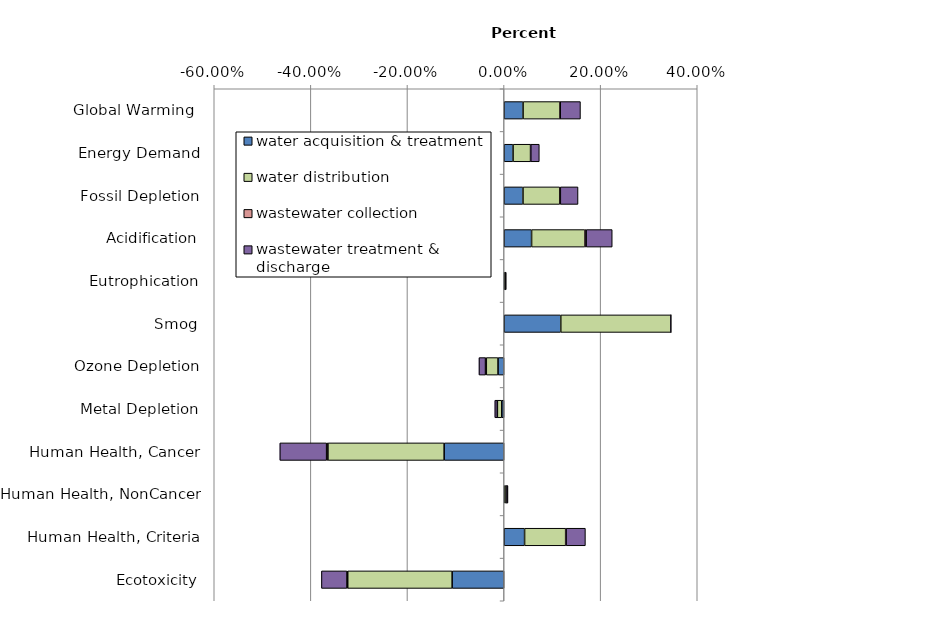
| Category | water acquisition & treatment | water distribution | wastewater collection | wastewater treatment & discharge |
|---|---|---|---|---|
| Global Warming  | 0.039 | 0.076 | 0.001 | 0.042 |
| Energy Demand | 0.019 | 0.036 | 0.001 | 0.018 |
| Fossil Depletion | 0.039 | 0.076 | 0.001 | 0.037 |
| Acidification | 0.057 | 0.111 | 0.002 | 0.054 |
| Eutrophication | 0.001 | 0.002 | 0 | 0.001 |
| Smog | 0.117 | 0.228 | 0 | 0.001 |
| Ozone Depletion | -0.012 | -0.024 | -0.002 | -0.014 |
| Metal Depletion | -0.005 | -0.009 | 0 | -0.005 |
| Human Health, Cancer | -0.124 | -0.241 | -0.003 | -0.097 |
| Human Health, NonCancer | 0.002 | 0.004 | 0 | 0.002 |
| Human Health, Criteria | 0.043 | 0.085 | 0.001 | 0.04 |
| Ecotoxicity | -0.107 | -0.216 | -0.002 | -0.053 |